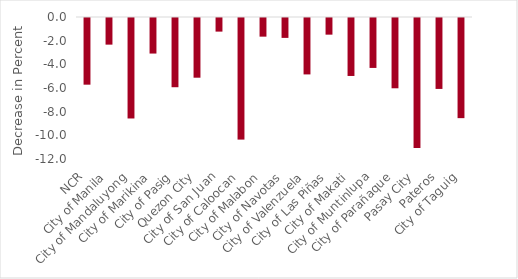
| Category | Series 0 |
|---|---|
| NCR | -5.634 |
| City of Manila | -2.251 |
| City of Mandaluyong | -8.491 |
| City of Marikina | -3.005 |
| City of Pasig | -5.85 |
| Quezon City | -5.045 |
| City of San Juan | -1.15 |
| City of Caloocan | -10.276 |
| City of Malabon | -1.576 |
| City of Navotas | -1.681 |
| City of Valenzuela | -4.768 |
| City of Las Piñas | -1.407 |
| City of Makati | -4.899 |
| City of Muntinlupa | -4.219 |
| City of Parañaque | -5.94 |
| Pasay City | -10.976 |
| Pateros | -5.994 |
| City of Taguig | -8.463 |